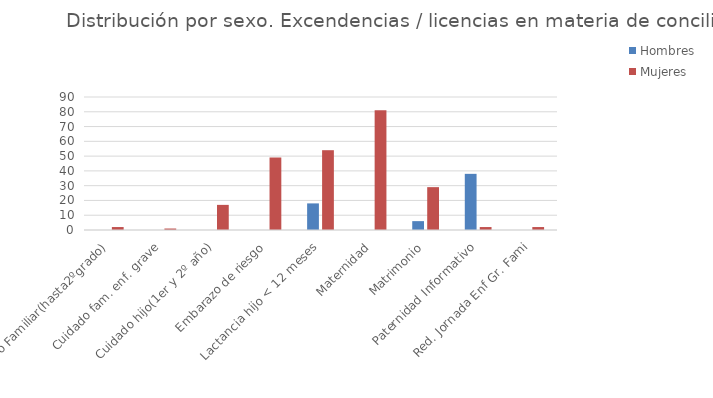
| Category | Hombres | Mujeres |
|---|---|---|
| Cuidado Familiar(hasta2ºgrado) | 0 | 2 |
| Cuidado fam. enf. grave | 0 | 1 |
| Cuidado hijo(1er y 2º año) | 0 | 17 |
| Embarazo de riesgo | 0 | 49 |
| Lactancia hijo < 12 meses | 18 | 54 |
| Maternidad | 0 | 81 |
| Matrimonio | 6 | 29 |
| Paternidad Informativo | 38 | 2 |
| Red. Jornada Enf Gr. Fami | 0 | 2 |